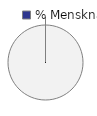
| Category | 4 - Mensknap |
|---|---|
| 0 | 0 |
| 1 | 1 |